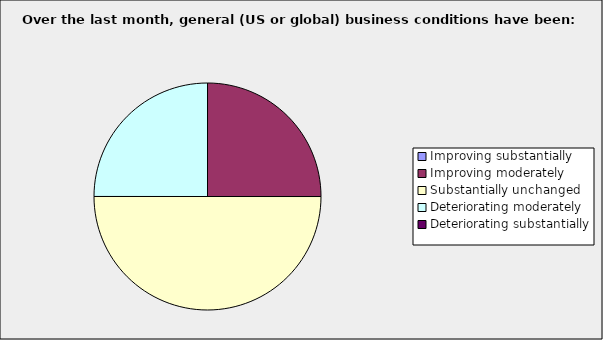
| Category | Series 0 |
|---|---|
| Improving substantially | 0 |
| Improving moderately | 0.25 |
| Substantially unchanged | 0.5 |
| Deteriorating moderately | 0.25 |
| Deteriorating substantially | 0 |